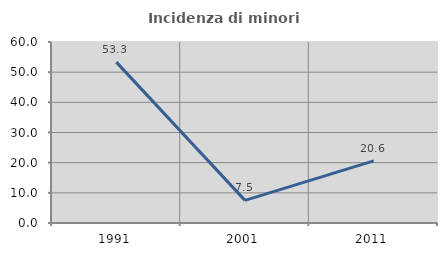
| Category | Incidenza di minori stranieri |
|---|---|
| 1991.0 | 53.333 |
| 2001.0 | 7.5 |
| 2011.0 | 20.574 |